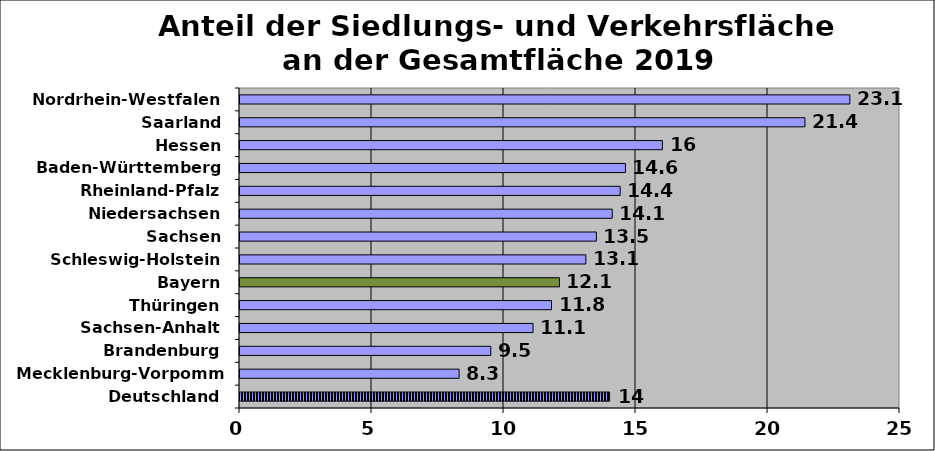
| Category | Series 0 |
|---|---|
| Deutschland | 14 |
| Mecklenburg-Vorpommern | 8.3 |
| Brandenburg | 9.5 |
| Sachsen-Anhalt | 11.1 |
| Thüringen | 11.8 |
| Bayern | 12.1 |
| Schleswig-Holstein | 13.1 |
| Sachsen | 13.5 |
| Niedersachsen | 14.1 |
| Rheinland-Pfalz | 14.4 |
| Baden-Württemberg | 14.6 |
| Hessen | 16 |
| Saarland | 21.4 |
| Nordrhein-Westfalen | 23.1 |